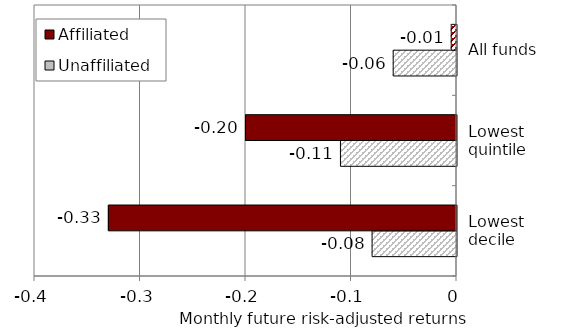
| Category | Unaffiliated | Affiliated |
|---|---|---|
| Lowest decile | -0.08 | -0.33 |
| Lowest quintile | -0.11 | -0.2 |
| All funds | -0.06 | -0.005 |